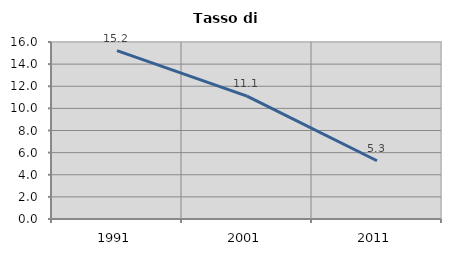
| Category | Tasso di disoccupazione   |
|---|---|
| 1991.0 | 15.217 |
| 2001.0 | 11.111 |
| 2011.0 | 5.263 |